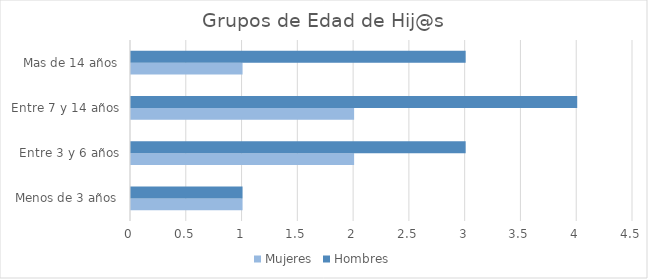
| Category | Mujeres | Hombres |
|---|---|---|
| Menos de 3 años | 1 | 1 |
| Entre 3 y 6 años | 2 | 3 |
| Entre 7 y 14 años | 2 | 4 |
| Mas de 14 años | 1 | 3 |